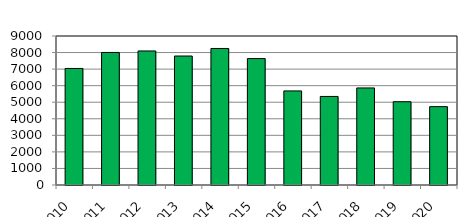
| Category | Series 1 |
|---|---|
| 2010 | 7039 |
| 2011 | 8006 |
| 2012 | 8096 |
| 2013 | 7791 |
| 2014 | 8246 |
| 2015 | 7636 |
| 2016 | 5683 |
| 2017 | 5349 |
| 2018 | 5862 |
| 2019 | 5030 |
| 2020 | 4734 |